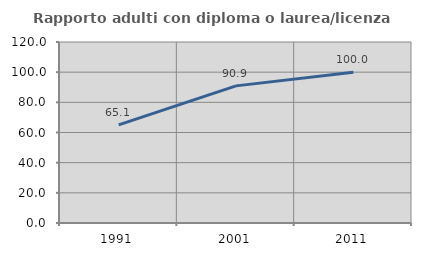
| Category | Rapporto adulti con diploma o laurea/licenza media  |
|---|---|
| 1991.0 | 65.06 |
| 2001.0 | 90.909 |
| 2011.0 | 100 |